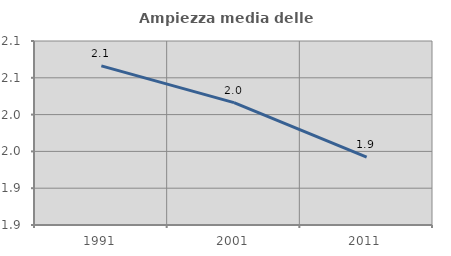
| Category | Ampiezza media delle famiglie |
|---|---|
| 1991.0 | 2.066 |
| 2001.0 | 2.016 |
| 2011.0 | 1.942 |